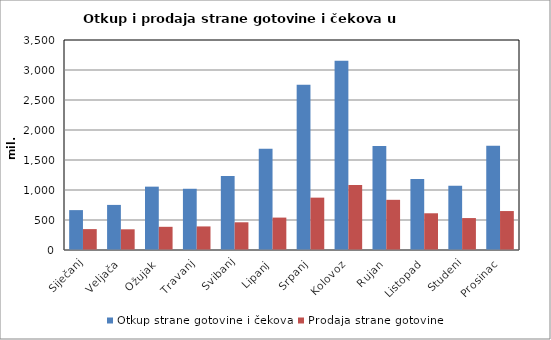
| Category | Otkup strane gotovine i čekova  | Prodaja strane gotovine  |
|---|---|---|
| Siječanj | 664769760 | 348171034 |
| Veljača | 751521200 | 344928997 |
| Ožujak | 1055898276 | 386485301 |
| Travanj | 1020513501 | 392819589 |
| Svibanj | 1232236651 | 461787954 |
| Lipanj | 1686655339 | 540146321 |
| Srpanj | 2754000360 | 872731702 |
| Kolovoz | 3156066953 | 1083812301 |
| Rujan | 1735118728 | 836370634 |
| Listopad | 1183494590 | 612024383 |
| Studeni | 1072746101 | 532250018 |
| Prosinac | 1738583794 | 649164297 |